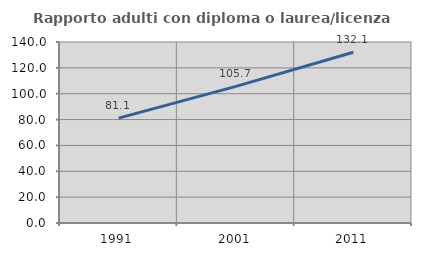
| Category | Rapporto adulti con diploma o laurea/licenza media  |
|---|---|
| 1991.0 | 81.116 |
| 2001.0 | 105.703 |
| 2011.0 | 132.09 |